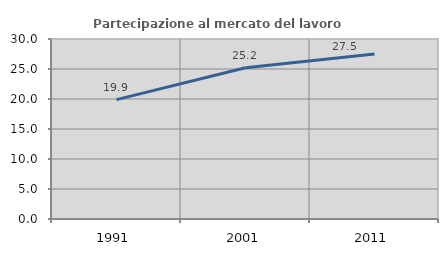
| Category | Partecipazione al mercato del lavoro  femminile |
|---|---|
| 1991.0 | 19.895 |
| 2001.0 | 25.202 |
| 2011.0 | 27.515 |